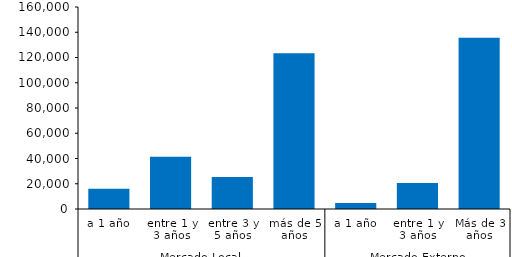
| Category | IV |
|---|---|
| 0 | 16078.365 |
| 1 | 41297.324 |
| 2 | 25318.448 |
| 3 | 123338.72 |
| 4 | 4665.798 |
| 5 | 20525.732 |
| 6 | 135689.127 |